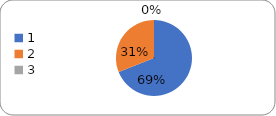
| Category | Series 0 |
|---|---|
| 0 | 69 |
| 1 | 31 |
| 2 | 0 |